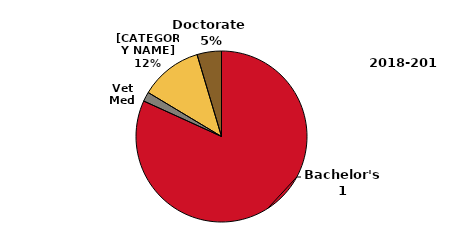
| Category | 2018-2019 |
|---|---|
| Bachelor's1 | 6893 |
| Vet Med | 151 |
| Master's | 993 |
| Doctorate | 389 |